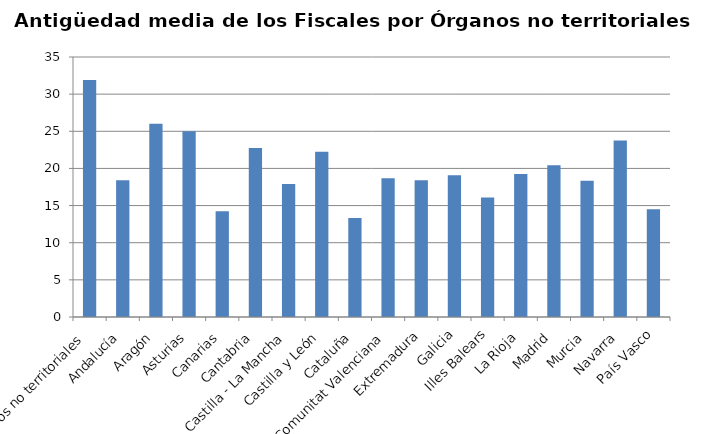
| Category | Series 0 |
|---|---|
| Órganos no territoriales | 31.92 |
| Andalucía | 18.4 |
| Aragón | 26 |
| Asturias | 25 |
| Canarias | 14.25 |
| Cantabria | 22.75 |
| Castilla - La Mancha | 17.92 |
| Castilla y León | 22.25 |
| Cataluña | 13.33 |
| Comunitat Valenciana | 18.67 |
| Extremadura | 18.42 |
| Galicia | 19.08 |
| Illes Balears | 16.08 |
| La Rioja | 19.25 |
| Madrid | 20.42 |
| Murcia | 18.33 |
| Navarra | 23.75 |
| País Vasco | 14.5 |